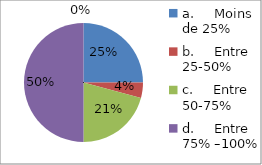
| Category | Series 0 |
|---|---|
| a.     Moins de 25%  | 0.25 |
| b.     Entre 25-50%  | 0.042 |
| c.     Entre 50-75%  | 0.208 |
| d.     Entre 75% –100%  | 0.5 |
| e.     Plus de 100%  | 0 |